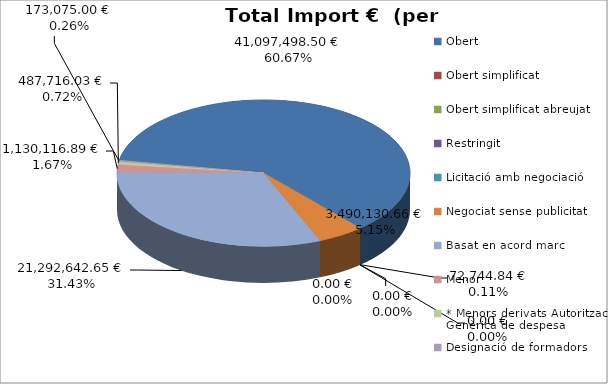
| Category | Total preu              (amb iva) |
|---|---|
| Obert | 41097498.5 |
| Obert simplificat | 72744.84 |
| Obert simplificat abreujat | 0 |
| Restringit | 0 |
| Licitació amb negociació | 0 |
| Negociat sense publicitat | 3490130.66 |
| Basat en acord marc | 21292642.65 |
| Menor | 1130116.89 |
| * Menors derivats Autorització Genèrica de despesa | 487716.03 |
| Designació de formadors | 173075 |